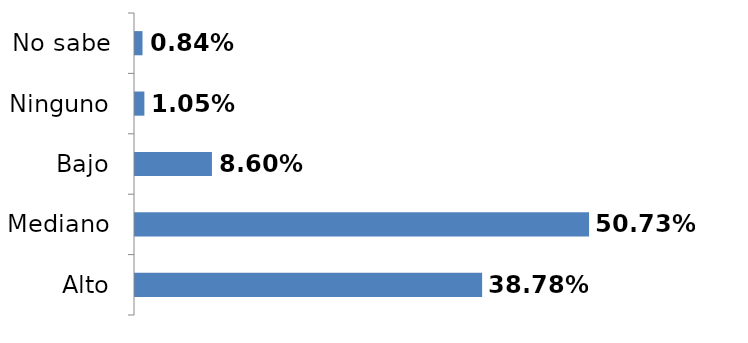
| Category | Series 0 |
|---|---|
| Alto | 0.388 |
| Mediano | 0.507 |
| Bajo | 0.086 |
| Ninguno | 0.01 |
| No sabe | 0.008 |